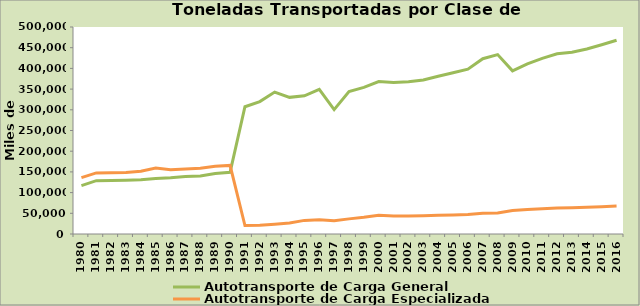
| Category | Autotransporte de Carga General | Autotransporte de Carga Especializada |
|---|---|---|
| 1980.0 | 117023 | 136146 |
| 1981.0 | 128754 | 147538 |
| 1982.0 | 129354 | 147999 |
| 1983.0 | 129714 | 148368 |
| 1984.0 | 130806 | 151377 |
| 1985.0 | 134112 | 159297 |
| 1986.0 | 135595 | 154964 |
| 1987.0 | 138810 | 157278 |
| 1988.0 | 140134 | 158736 |
| 1989.0 | 146292 | 163511 |
| 1990.0 | 149009 | 165666 |
| 1991.0 | 307444 | 20329 |
| 1992.0 | 319742 | 21318 |
| 1993.0 | 342871 | 23757 |
| 1994.0 | 330053 | 26434 |
| 1995.0 | 333800 | 32873 |
| 1996.0 | 349142 | 34125 |
| 1997.0 | 300444 | 32022 |
| 1998.0 | 344282 | 36519 |
| 1999.0 | 354241 | 40191 |
| 2000.0 | 368066 | 45127 |
| 2001.0 | 365912 | 43298 |
| 2002.0 | 367600 | 43500 |
| 2003.0 | 372150 | 44050 |
| 2004.0 | 381000 | 45100 |
| 2005.0 | 389400 | 46100 |
| 2006.0 | 398158 | 47291 |
| 2007.0 | 423458.767 | 50401.095 |
| 2008.0 | 433400 | 50900 |
| 2009.0 | 394079 | 56821 |
| 2010.0 | 410772 | 59228 |
| 2011.0 | 424321 | 61181 |
| 2012.0 | 435373 | 62774 |
| 2013.0 | 438871 | 63279 |
| 2014.0 | 446903 | 64437 |
| 2015.0 | 457085 | 65905 |
| 2016.0 | 468060 | 67488 |